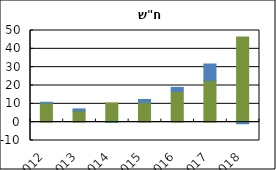
| Category | הבלאי | גידול המחזור |
|---|---|---|
| 2012.0 | 10.321 | 0.531 |
| 2013.0 | 6.112 | 1.118 |
| 2014.0 | 10.464 | -0.188 |
| 2015.0 | 10.696 | 1.679 |
| 2016.0 | 16.724 | 2.258 |
| 2017.0 | 22.745 | 8.988 |
| 2018.0 | 46.467 | -0.868 |